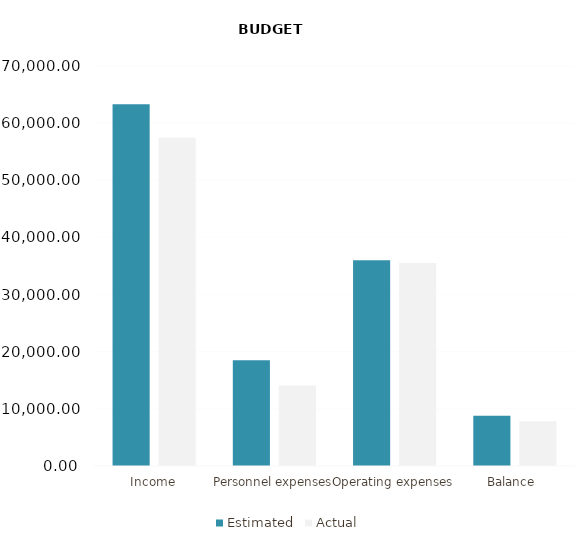
| Category | Estimated | Actual |
|---|---|---|
| Income | 63300 | 57450 |
| Personnel expenses | 18500 | 14100 |
| Operating expenses | 36000 | 35530 |